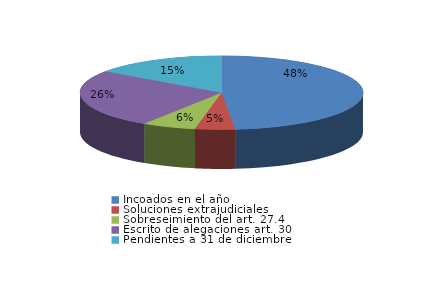
| Category | Series 0 |
|---|---|
| Incoados en el año | 363 |
| Soluciones extrajudiciales | 34 |
| Sobreseimiento del art. 27.4 | 46 |
| Escrito de alegaciones art. 30 | 192 |
| Pendientes a 31 de diciembre | 114 |